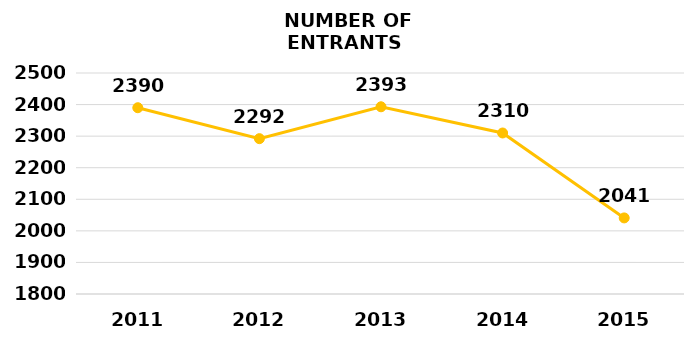
| Category | Series 1 |
|---|---|
| 2011.0 | 2390 |
| 2012.0 | 2292 |
| 2013.0 | 2393 |
| 2014.0 | 2310 |
| 2015.0 | 2041 |